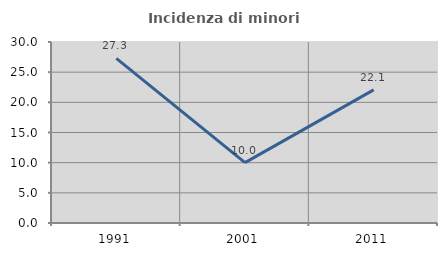
| Category | Incidenza di minori stranieri |
|---|---|
| 1991.0 | 27.273 |
| 2001.0 | 10 |
| 2011.0 | 22.059 |